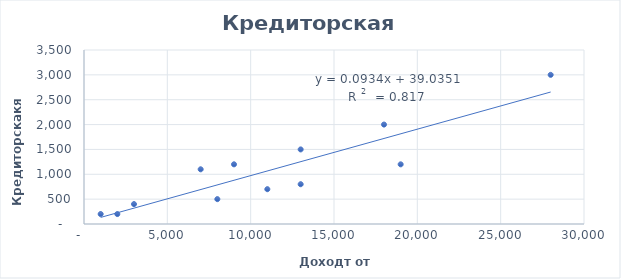
| Category |  Кредиторская задолженность  |
|---|---|
| 2000.0 | 200 |
| 8000.0 | 500 |
| 18000.0 | 2000 |
| 11000.0 | 700 |
| 13000.0 | 800 |
| 19000.0 | 1200 |
| 28000.0 | 3000 |
| 13000.0 | 1500 |
| 9000.0 | 1200 |
| 7000.0 | 1100 |
| 3000.0 | 400 |
| 1000.0 | 200 |